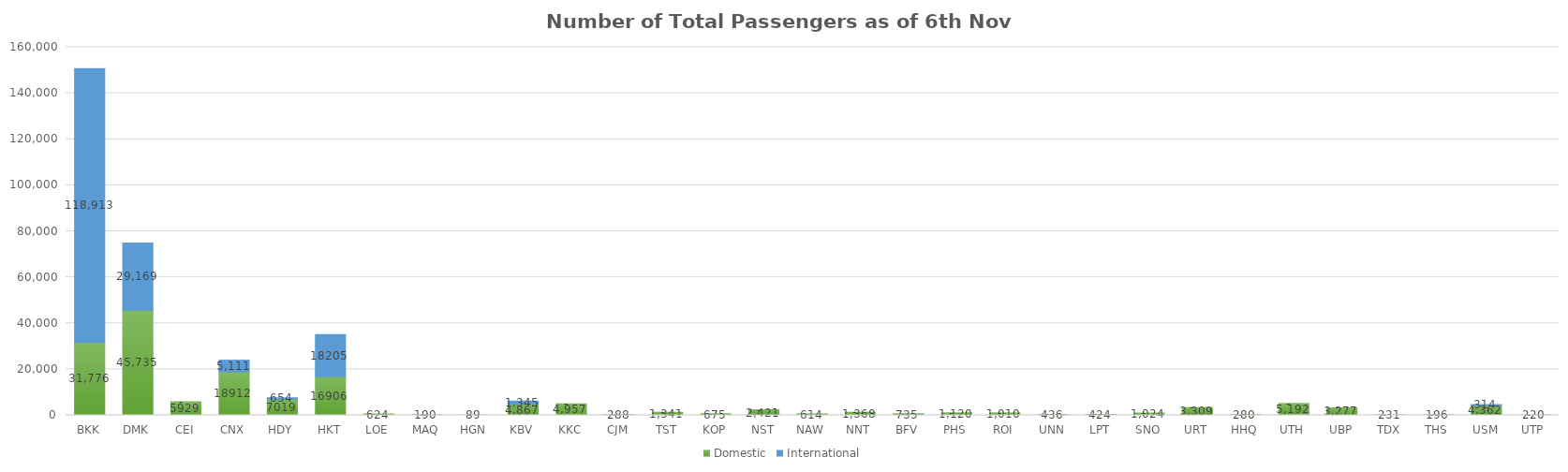
| Category | Domestic | International |
|---|---|---|
| BKK | 31776 | 118913 |
| DMK | 45735 | 29169 |
| CEI | 5929 | 0 |
| CNX | 18912 | 5111 |
| HDY | 7019 | 654 |
| HKT | 16906 | 18205 |
| LOE | 624 | 0 |
| MAQ | 190 | 0 |
| HGN | 89 | 0 |
| KBV | 4867 | 1345 |
| KKC | 4957 | 0 |
| CJM | 288 | 0 |
| TST | 1341 | 0 |
| KOP | 675 | 0 |
| NST | 2421 | 0 |
| NAW | 614 | 0 |
| NNT | 1368 | 0 |
| BFV | 735 | 0 |
| PHS | 1120 | 0 |
| ROI | 1010 | 0 |
| UNN | 436 | 0 |
| LPT | 424 | 0 |
| SNO | 1024 | 0 |
| URT | 3309 | 0 |
| HHQ | 280 | 0 |
| UTH | 5192 | 0 |
| UBP | 3277 | 0 |
| TDX | 231 | 0 |
| THS | 196 | 0 |
| USM | 4362 | 314 |
| UTP | 220 | 0 |